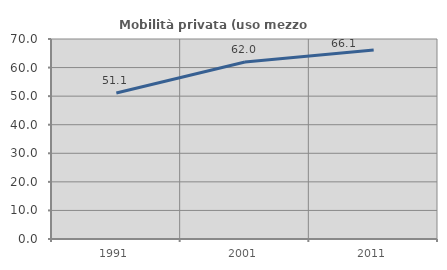
| Category | Mobilità privata (uso mezzo privato) |
|---|---|
| 1991.0 | 51.1 |
| 2001.0 | 61.969 |
| 2011.0 | 66.142 |